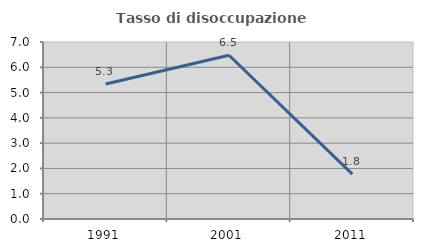
| Category | Tasso di disoccupazione giovanile  |
|---|---|
| 1991.0 | 5.337 |
| 2001.0 | 6.475 |
| 2011.0 | 1.775 |